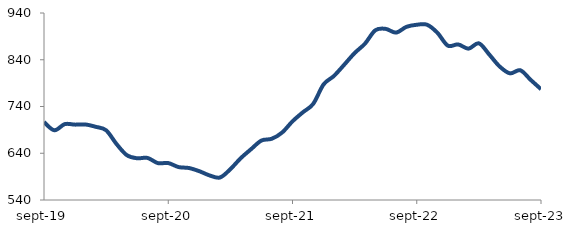
| Category | Series 0 |
|---|---|
| 2019-09-01 | 706.734 |
| 2019-10-01 | 689.137 |
| 2019-11-01 | 702.277 |
| 2019-12-01 | 701.214 |
| 2020-01-01 | 701.517 |
| 2020-02-01 | 696.552 |
| 2020-03-01 | 689.099 |
| 2020-04-01 | 659.896 |
| 2020-05-01 | 635.894 |
| 2020-06-01 | 629.29 |
| 2020-07-01 | 629.994 |
| 2020-08-01 | 618.866 |
| 2020-09-01 | 619.022 |
| 2020-10-01 | 610.428 |
| 2020-11-01 | 608.402 |
| 2020-12-01 | 601.605 |
| 2021-01-01 | 592.504 |
| 2021-02-01 | 588.185 |
| 2021-03-01 | 605.989 |
| 2021-04-01 | 629.446 |
| 2021-05-01 | 648.73 |
| 2021-06-01 | 667.177 |
| 2021-07-01 | 670.996 |
| 2021-08-01 | 684.389 |
| 2021-09-01 | 708.308 |
| 2021-10-01 | 727.608 |
| 2021-11-01 | 745.65 |
| 2021-12-01 | 787.184 |
| 2022-01-01 | 805.308 |
| 2022-02-01 | 829.502 |
| 2022-03-01 | 854.336 |
| 2022-04-01 | 874.453 |
| 2022-05-01 | 903.049 |
| 2022-06-01 | 906.022 |
| 2022-07-01 | 898.071 |
| 2022-08-01 | 910.353 |
| 2022-09-01 | 914.859 |
| 2022-10-01 | 914.857 |
| 2022-11-01 | 897.607 |
| 2022-12-01 | 870.196 |
| 2023-01-01 | 872.784 |
| 2023-02-01 | 863.736 |
| 2023-03-01 | 875.118 |
| 2023-04-01 | 851.276 |
| 2023-05-01 | 825.667 |
| 2023-06-01 | 810.924 |
| 2023-07-01 | 817.469 |
| 2023-08-01 | 797.001 |
| 2023-09-01 | 777.024 |